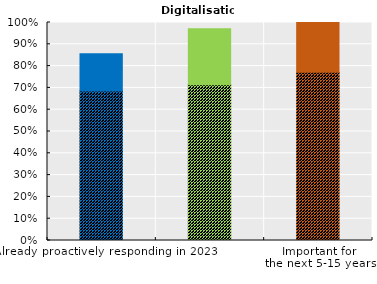
| Category | Digitalisation | Series 1 |
|---|---|---|
| Already proactively responding in 2023 | 0.686 | 0.171 |
| Important for
2024 | 0.714 | 0.257 |
| Important for
the next 5-15 years | 0.771 | 0.229 |